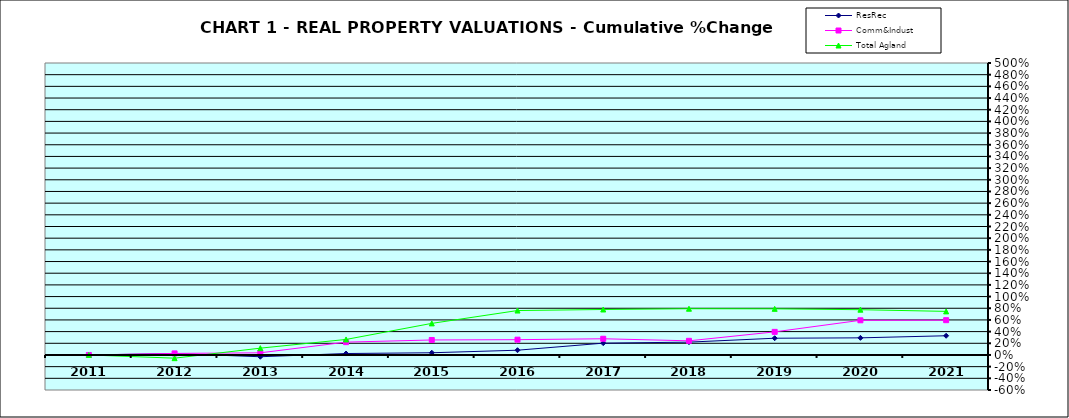
| Category | ResRec | Comm&Indust | Total Agland |
|---|---|---|---|
| 2011.0 | 0 | 0 | 0 |
| 2012.0 | 0.023 | 0.027 | -0.055 |
| 2013.0 | -0.03 | 0.037 | 0.116 |
| 2014.0 | 0.025 | 0.22 | 0.266 |
| 2015.0 | 0.038 | 0.257 | 0.541 |
| 2016.0 | 0.081 | 0.262 | 0.761 |
| 2017.0 | 0.202 | 0.278 | 0.779 |
| 2018.0 | 0.22 | 0.242 | 0.792 |
| 2019.0 | 0.287 | 0.396 | 0.79 |
| 2020.0 | 0.293 | 0.593 | 0.775 |
| 2021.0 | 0.329 | 0.596 | 0.746 |